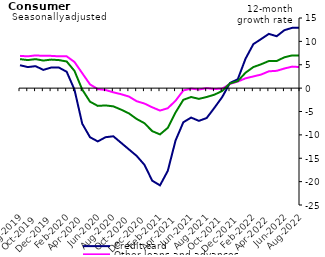
| Category | Credit card | Other loans and advances | Total |
|---|---|---|---|
| Aug-2019 | 4.9 | 6.9 | 6.2 |
| Sep-2019 | 4.5 | 6.8 | 6 |
| Oct-2019 | 4.7 | 7 | 6.2 |
| Nov-2019 | 3.9 | 6.9 | 5.9 |
| Dec-2019 | 4.4 | 6.9 | 6.1 |
| Jan-2020 | 4.4 | 6.8 | 6 |
| Feb-2020 | 3.5 | 6.8 | 5.7 |
| Mar-2020 | -0.3 | 5.6 | 3.7 |
| Apr-2020 | -7.6 | 3.2 | -0.3 |
| May-2020 | -10.5 | 0.8 | -2.9 |
| Jun-2020 | -11.4 | -0.2 | -3.8 |
| Jul-2020 | -10.5 | -0.4 | -3.7 |
| Aug-2020 | -10.3 | -0.9 | -3.9 |
| Sep-2020 | -11.7 | -1.3 | -4.6 |
| Oct-2020 | -13.1 | -1.8 | -5.4 |
| Nov-2020 | -14.5 | -2.8 | -6.6 |
| Dec-2020 | -16.4 | -3.3 | -7.5 |
| Jan-2021 | -19.8 | -4.1 | -9.2 |
| Feb-2021 | -20.8 | -4.8 | -9.9 |
| Mar-2021 | -17.7 | -4.3 | -8.5 |
| Apr-2021 | -11.2 | -2.7 | -5.2 |
| May-2021 | -7.3 | -0.5 | -2.5 |
| Jun-2021 | -6.3 | -0.1 | -1.9 |
| Jul-2021 | -7 | -0.3 | -2.3 |
| Aug-2021 | -6.4 | 0 | -1.9 |
| Sep-2021 | -4.2 | -0.2 | -1.4 |
| Oct-2021 | -1.9 | -0.1 | -0.6 |
| Nov-2021 | 1.1 | 0.9 | 1 |
| Dec-2021 | 1.9 | 1.4 | 1.5 |
| Jan-2022 | 6.3 | 2.1 | 3.3 |
| Feb-2022 | 9.4 | 2.5 | 4.5 |
| Mar-2022 | 10.5 | 2.9 | 5.1 |
| Apr-2022 | 11.6 | 3.6 | 5.8 |
| May-2022 | 11.1 | 3.7 | 5.8 |
| Jun-2022 | 12.4 | 4.2 | 6.6 |
| Jul-2022 | 12.9 | 4.6 | 7 |
| Aug-2022 | 12.9 | 4.5 | 7 |